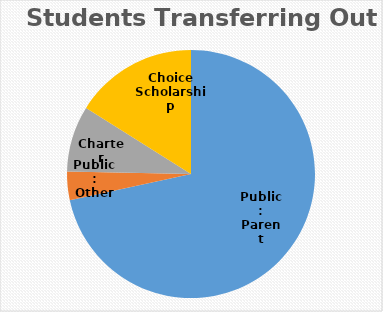
| Category | Series 0 |
|---|---|
| Public: Parent Choice | 58 |
| Public: Other | 3 |
| Charter | 7 |
| Choice Scholarship | 13 |